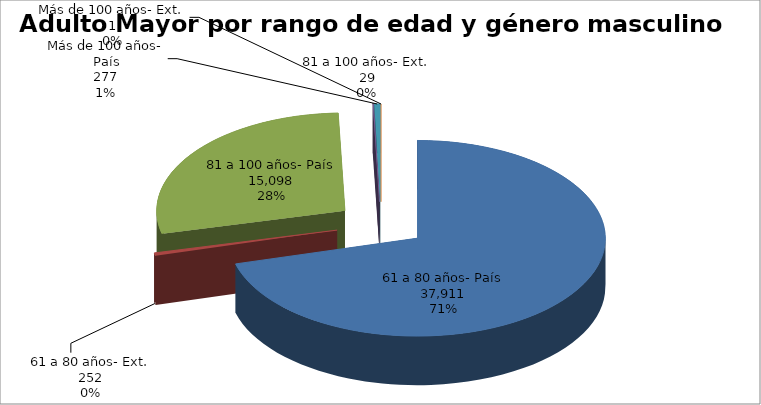
| Category | Series 0 |
|---|---|
| 61 a 80 años- País | 37911 |
| 61 a 80 años- Ext. | 252 |
| 81 a 100 años- País | 15098 |
| 81 a 100 años- Ext. | 29 |
| Más de 100 años- País | 277 |
| Más de 100 años- Ext. | 1 |